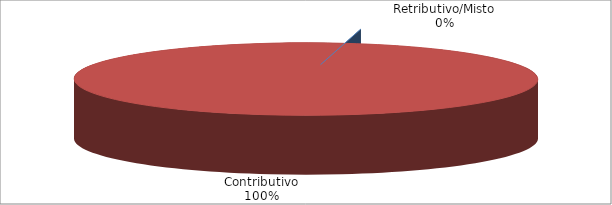
| Category | Series 1 |
|---|---|
| Retributivo/Misto | 0 |
| Contributivo | 28072 |